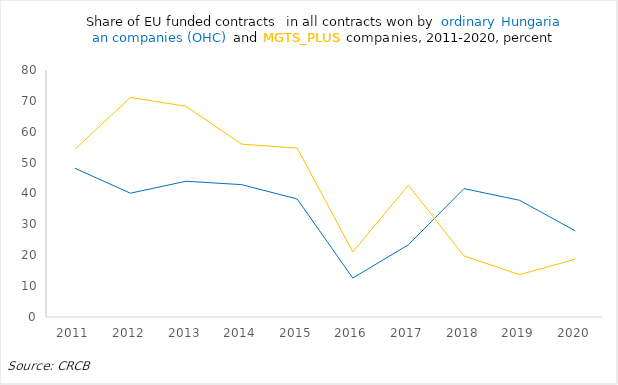
| Category | ohc | mgts_plus |
|---|---|---|
| 2011.0 | 48.19 | 54.29 |
| 2012.0 | 40.1 | 71.11 |
| 2013.0 | 43.97 | 68.24 |
| 2014.0 | 42.87 | 55.98 |
| 2015.0 | 38.22 | 54.71 |
| 2016.0 | 12.62 | 21.11 |
| 2017.0 | 23.4 | 42.68 |
| 2018.0 | 41.58 | 19.79 |
| 2019.0 | 37.79 | 13.71 |
| 2020.0 | 27.91 | 18.72 |